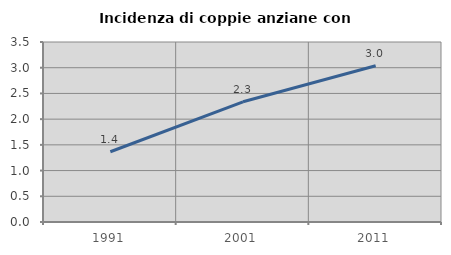
| Category | Incidenza di coppie anziane con figli |
|---|---|
| 1991.0 | 1.366 |
| 2001.0 | 2.337 |
| 2011.0 | 3.038 |